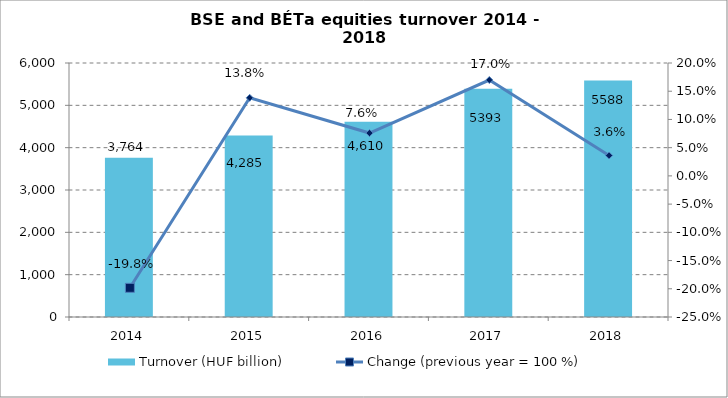
| Category | Turnover (HUF billion) |
|---|---|
| 2014.0 | 3764 |
| 2015.0 | 4284.718 |
| 2016.0 | 4610 |
| 2017.0 | 5393 |
| 2018.0 | 5588 |